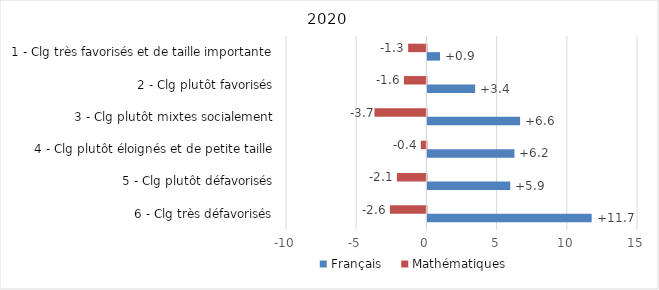
| Category | Français | Mathématiques |
|---|---|---|
| 6 - Clg très défavorisés | 11.7 | -2.6 |
| 5 - Clg plutôt défavorisés | 5.9 | -2.1 |
| 4 - Clg plutôt éloignés et de petite taille | 6.2 | -0.4 |
| 3 - Clg plutôt mixtes socialement | 6.6 | -3.7 |
| 2 - Clg plutôt favorisés | 3.4 | -1.6 |
| 1 - Clg très favorisés et de taille importante | 0.9 | -1.3 |